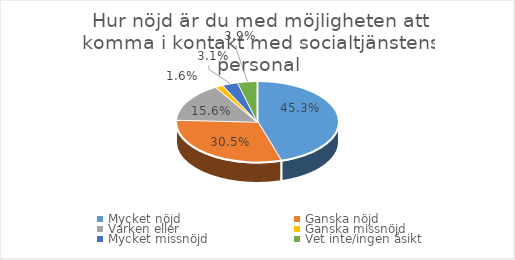
| Category | Series 0 |
|---|---|
| Mycket nöjd  | 0.453 |
| Ganska nöjd | 0.305 |
| Varken eller  | 0.156 |
| Ganska missnöjd | 0.016 |
| Mycket missnöjd  | 0.031 |
| Vet inte/ingen åsikt | 0.039 |